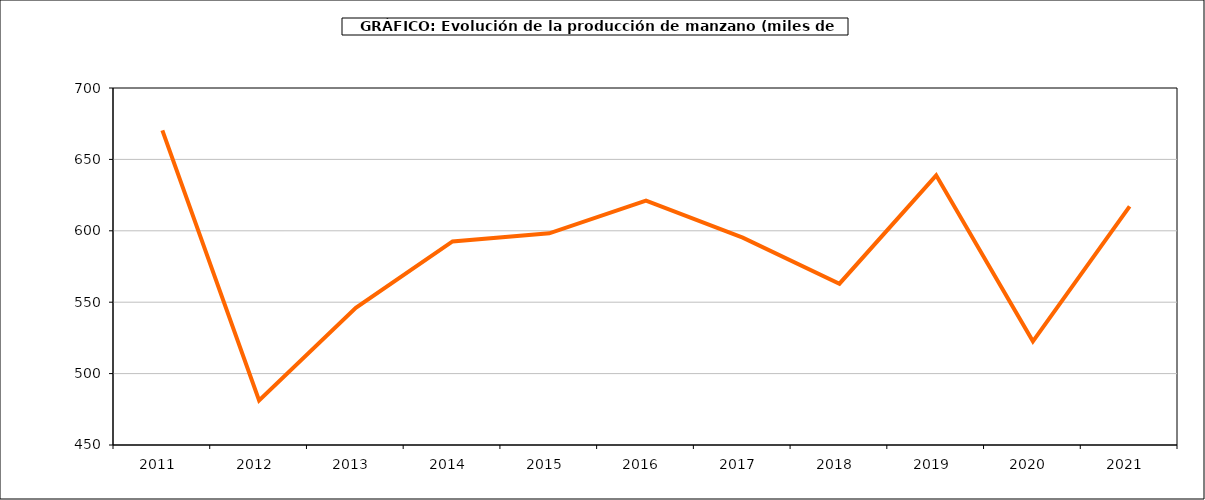
| Category | producción manzano |
|---|---|
| 2011.0 | 670.284 |
| 2012.0 | 481.223 |
| 2013.0 | 545.992 |
| 2014.0 | 592.576 |
| 2015.0 | 598.207 |
| 2016.0 | 621.164 |
| 2017.0 | 595.202 |
| 2018.0 | 562.961 |
| 2019.0 | 638.839 |
| 2020.0 | 522.618 |
| 2021.0 | 617.095 |